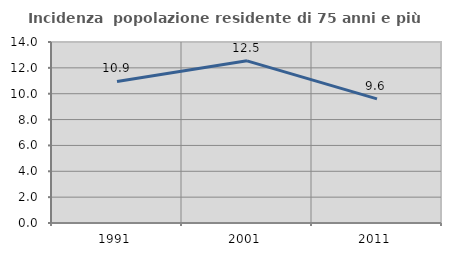
| Category | Incidenza  popolazione residente di 75 anni e più |
|---|---|
| 1991.0 | 10.945 |
| 2001.0 | 12.542 |
| 2011.0 | 9.603 |